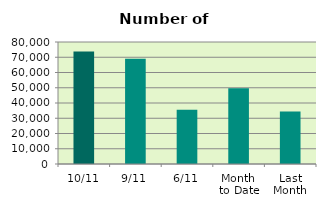
| Category | Series 0 |
|---|---|
| 10/11 | 73692 |
| 9/11 | 69012 |
| 6/11 | 35586 |
| Month 
to Date | 49713.429 |
| Last
Month | 34490.636 |